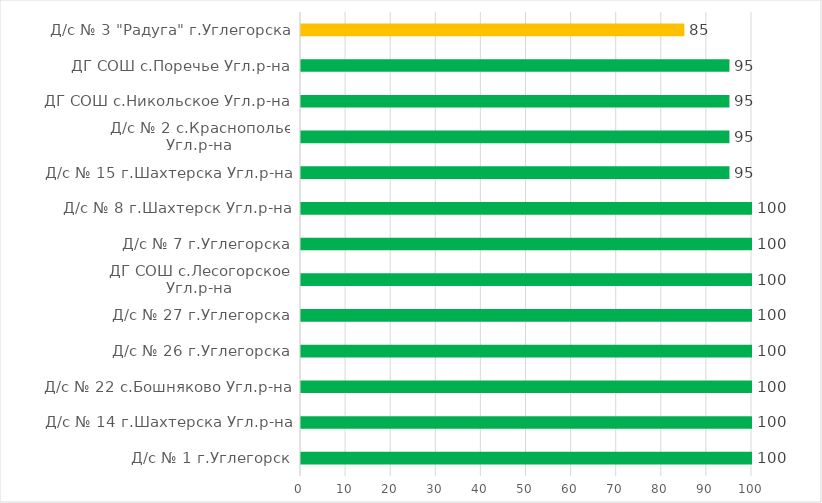
| Category | Series 0 |
|---|---|
| Д/с № 1 г.Углегорск | 100 |
| Д/с № 14 г.Шахтерска Угл.р-на | 100 |
| Д/с № 22 с.Бошняково Угл.р-на | 100 |
| Д/с № 26 г.Углегорска | 100 |
| Д/с № 27 г.Углегорска | 100 |
| ДГ СОШ с.Лесогорское Угл.р-на | 100 |
| Д/с № 7 г.Углегорска | 100 |
| Д/с № 8 г.Шахтерск Угл.р-на | 100 |
| Д/с № 15 г.Шахтерска Угл.р-на | 95 |
| Д/с № 2 с.Краснополье Угл.р-на | 95 |
| ДГ СОШ с.Никольское Угл.р-на | 95 |
| ДГ СОШ с.Поречье Угл.р-на | 95 |
| Д/с № 3 "Радуга" г.Углегорска | 85 |